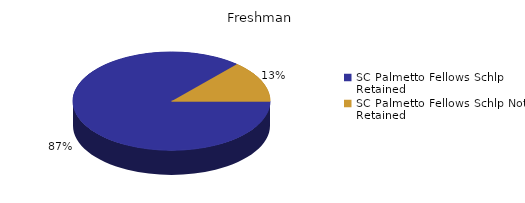
| Category | Freshman |
|---|---|
| SC Palmetto Fellows Schlp Retained  | 270 |
| SC Palmetto Fellows Schlp Not Retained  | 42 |